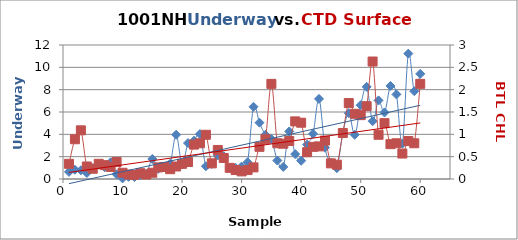
| Category |  FL |
|---|---|
| 0 | 0.636 |
| 1 | 0.827 |
| 2 | 0.777 |
| 3 | 0.536 |
| 4 | 0.965 |
| 5 | 1.27 |
| 6 | 1.052 |
| 7 | 1.493 |
| 8 | 0.421 |
| 9 | 0.058 |
| 10 | 0.198 |
| 11 | 0.176 |
| 12 | 0.34 |
| 13 | 0.444 |
| 14 | 1.793 |
| 15 | 0.915 |
| 16 | 1.11 |
| 17 | 1.361 |
| 18 | 3.963 |
| 19 | 1.297 |
| 20 | 3.217 |
| 21 | 3.429 |
| 22 | 4.025 |
| 23 | 1.143 |
| 24 | 1.348 |
| 25 | 2.12 |
| 26 | 2.047 |
| 27 | 0.988 |
| 28 | 0.992 |
| 29 | 1.11 |
| 30 | 1.501 |
| 31 | 6.466 |
| 32 | 5.043 |
| 33 | 3.958 |
| 34 | 3.572 |
| 35 | 1.656 |
| 36 | 1.083 |
| 37 | 4.256 |
| 38 | 2.23 |
| 39 | 1.634 |
| 40 | 3.076 |
| 41 | 4.046 |
| 42 | 7.174 |
| 43 | 2.802 |
| 44 | 1.448 |
| 45 | 0.97 |
| 46 | 4.103 |
| 47 | 5.896 |
| 48 | 3.963 |
| 49 | 6.611 |
| 50 | 8.252 |
| 51 | 5.179 |
| 52 | 7.038 |
| 53 | 5.956 |
| 54 | 8.333 |
| 55 | 7.575 |
| 56 | 3.162 |
| 57 | 11.229 |
| 58 | 7.865 |
| 59 | 9.413 |